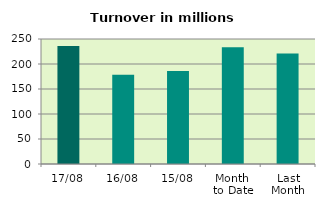
| Category | Series 0 |
|---|---|
| 17/08 | 235.958 |
| 16/08 | 178.31 |
| 15/08 | 185.887 |
| Month 
to Date | 233.525 |
| Last
Month | 220.762 |